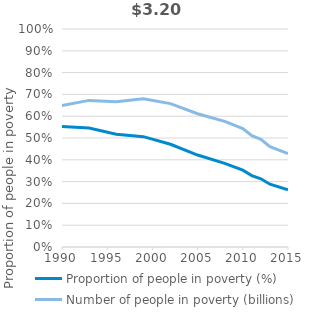
| Category | Proportion of people in poverty (%) |
|---|---|
| 1990.0 | 0.552 |
| 1993.0 | 0.546 |
| 1996.0 | 0.518 |
| 1999.0 | 0.506 |
| 2002.0 | 0.471 |
| 2005.0 | 0.422 |
| 2008.0 | 0.383 |
| 2010.0 | 0.352 |
| 2011.0 | 0.328 |
| 2012.0 | 0.313 |
| 2013.0 | 0.288 |
| 2015.0 | 0.262 |